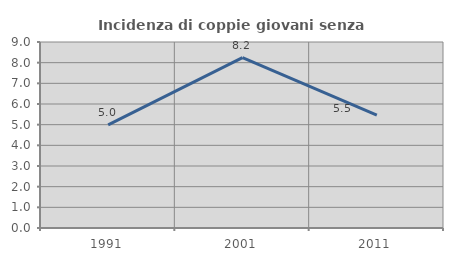
| Category | Incidenza di coppie giovani senza figli |
|---|---|
| 1991.0 | 4.986 |
| 2001.0 | 8.244 |
| 2011.0 | 5.461 |